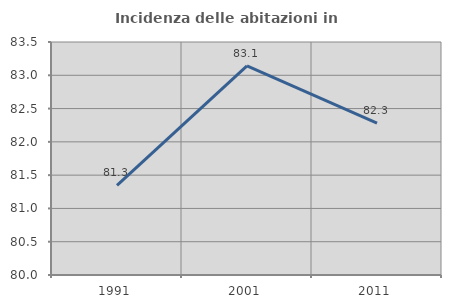
| Category | Incidenza delle abitazioni in proprietà  |
|---|---|
| 1991.0 | 81.346 |
| 2001.0 | 83.141 |
| 2011.0 | 82.282 |